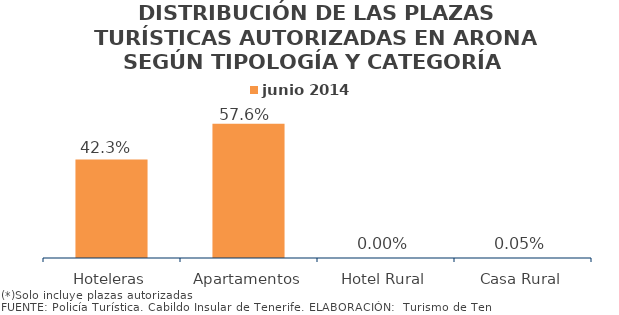
| Category | junio 2014 |
|---|---|
| Hoteleras | 0.423 |
| Apartamentos | 0.576 |
| Hotel Rural | 0 |
| Casa Rural | 0.001 |